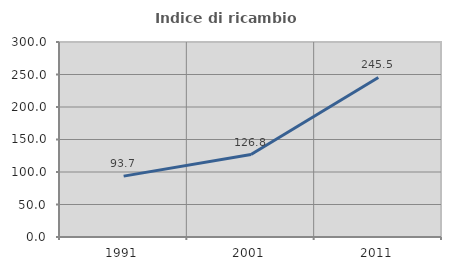
| Category | Indice di ricambio occupazionale  |
|---|---|
| 1991.0 | 93.659 |
| 2001.0 | 126.829 |
| 2011.0 | 245.522 |